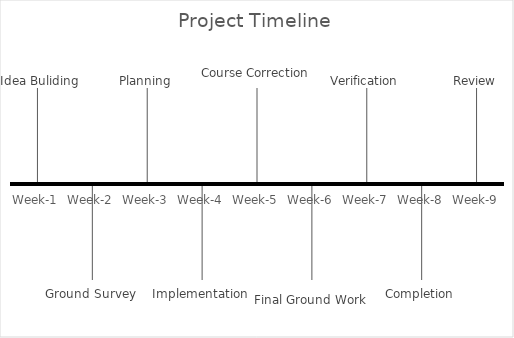
| Category | Series 0 |
|---|---|
| Week-1 | 1 |
| Week-2 | -1 |
| Week-3 | 1 |
| Week-4 | -1 |
| Week-5 | 1 |
| Week-6 | -1 |
| Week-7 | 1 |
| Week-8 | -1 |
| Week-9 | 1 |